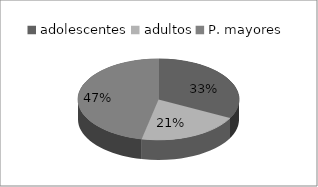
| Category | Series 0 |
|---|---|
| adolescentes | 107 |
| adultos | 68 |
| P. mayores | 153 |